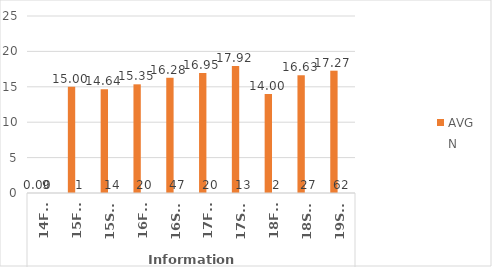
| Category | English - AVG | English - N |
|---|---|---|
| 0 | 0 | 9 |
| 1 | 15 | 1 |
| 2 | 14.643 | 14 |
| 3 | 15.35 | 20 |
| 4 | 16.277 | 47 |
| 5 | 16.95 | 20 |
| 6 | 17.923 | 13 |
| 7 | 14 | 2 |
| 8 | 16.63 | 27 |
| 9 | 17.274 | 62 |